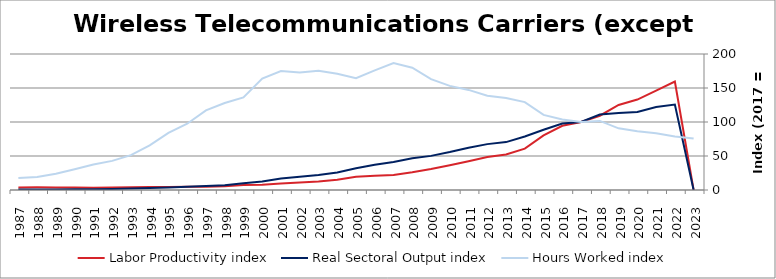
| Category | Labor Productivity index | Real Sectoral Output index | Hours Worked index |
|---|---|---|---|
| 2023.0 | 0 | 0 | 75.686 |
| 2022.0 | 159.581 | 125.731 | 78.788 |
| 2021.0 | 146.074 | 122.106 | 83.592 |
| 2020.0 | 132.982 | 114.859 | 86.372 |
| 2019.0 | 125.105 | 113.403 | 90.646 |
| 2018.0 | 109.252 | 111.028 | 101.625 |
| 2017.0 | 100 | 100 | 100 |
| 2016.0 | 94.466 | 97.865 | 103.598 |
| 2015.0 | 80.213 | 88.619 | 110.479 |
| 2014.0 | 60.819 | 78.587 | 129.213 |
| 2013.0 | 52.099 | 70.448 | 135.217 |
| 2012.0 | 48.668 | 67.473 | 138.638 |
| 2011.0 | 42.301 | 62.262 | 147.189 |
| 2010.0 | 36.43 | 55.773 | 153.095 |
| 2009.0 | 30.792 | 50.189 | 162.993 |
| 2008.0 | 26.003 | 46.784 | 179.916 |
| 2007.0 | 22.108 | 41.256 | 186.613 |
| 2006.0 | 21.091 | 37.1 | 175.905 |
| 2005.0 | 19.479 | 32.003 | 164.291 |
| 2004.0 | 15.06 | 25.751 | 170.988 |
| 2003.0 | 12.485 | 21.897 | 175.38 |
| 2002.0 | 11.208 | 19.375 | 172.869 |
| 2001.0 | 9.675 | 16.918 | 174.869 |
| 2000.0 | 7.582 | 12.42 | 163.812 |
| 1999.0 | 7.237 | 9.849 | 136.083 |
| 1998.0 | 5.451 | 6.972 | 127.909 |
| 1997.0 | 4.916 | 5.759 | 117.128 |
| 1996.0 | 4.952 | 4.829 | 97.508 |
| 1995.0 | 4.409 | 3.705 | 84.039 |
| 1994.0 | 4.391 | 2.885 | 65.703 |
| 1993.0 | 4.109 | 2.106 | 51.255 |
| 1992.0 | 3.677 | 1.574 | 42.794 |
| 1991.0 | 3.294 | 1.232 | 37.412 |
| 1990.0 | 3.508 | 1.072 | 30.551 |
| 1989.0 | 3.769 | 0.904 | 23.98 |
| 1988.0 | 3.886 | 0.745 | 19.179 |
| 1987.0 | 3.711 | 0.654 | 17.617 |